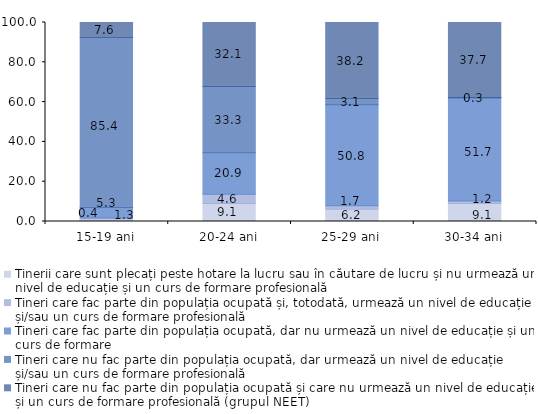
| Category | Tinerii care sunt plecați peste hotare la lucru sau în căutare de lucru și nu urmează un nivel de educație și un curs de formare profesională | Tineri care fac parte din populația ocupată și, totodată, urmează un nivel de educație și/sau un curs de formare profesională | Tineri care fac parte din populația ocupată, dar nu urmează un nivel de educație și un curs de formare | Tineri care nu fac parte din populația ocupată, dar urmează un nivel de educație și/sau un curs de formare profesională | Tineri care nu fac parte din populația ocupată și care nu urmează un nivel de educație și un curs de formare profesională (grupul NEET) |
|---|---|---|---|---|---|
| 15-19 ani | 1.3 | 0.4 | 5.3 | 85.4 | 7.6 |
| 20-24 ani | 9.1 | 4.6 | 20.9 | 33.3 | 32.1 |
| 25-29 ani | 6.2 | 1.7 | 50.8 | 3.1 | 38.2 |
| 30-34 ani | 9.1 | 1.2 | 51.7 | 0.3 | 37.7 |